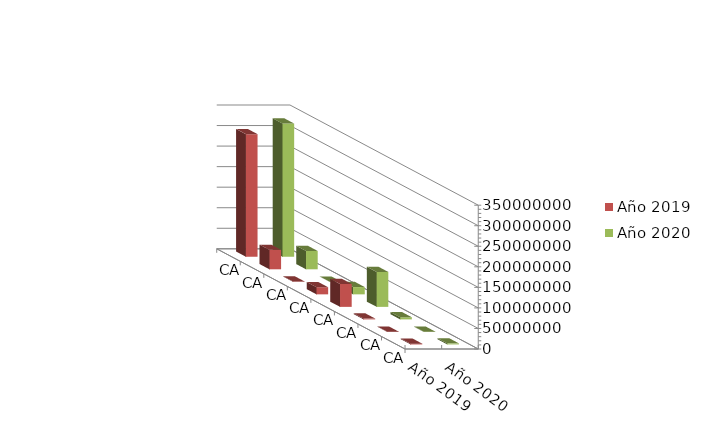
| Category | Año 2019 | Año 2020 |
|---|---|---|
| CAP. 1º | 298492474.121 | 324243504.538 |
| CAP. 2º | 47334443.08 | 44631588.078 |
| CAP. 3º | 900750.435 | 400750 |
| CAP. 4º | 17323020.39 | 17680952 |
| CAP. 6º | 55737477.32 | 84969041.66 |
| CAP. 7º | 1989200.49 | 5186000 |
| CAP. 8º | 649999.7 | 650000 |
| CAP.9º | 1827787.11 | 2600000 |